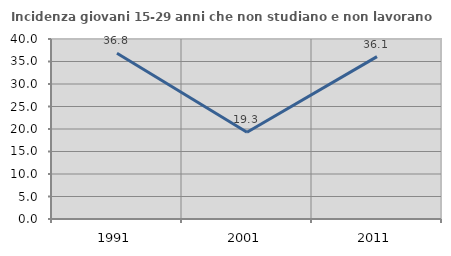
| Category | Incidenza giovani 15-29 anni che non studiano e non lavorano  |
|---|---|
| 1991.0 | 36.831 |
| 2001.0 | 19.286 |
| 2011.0 | 36.082 |